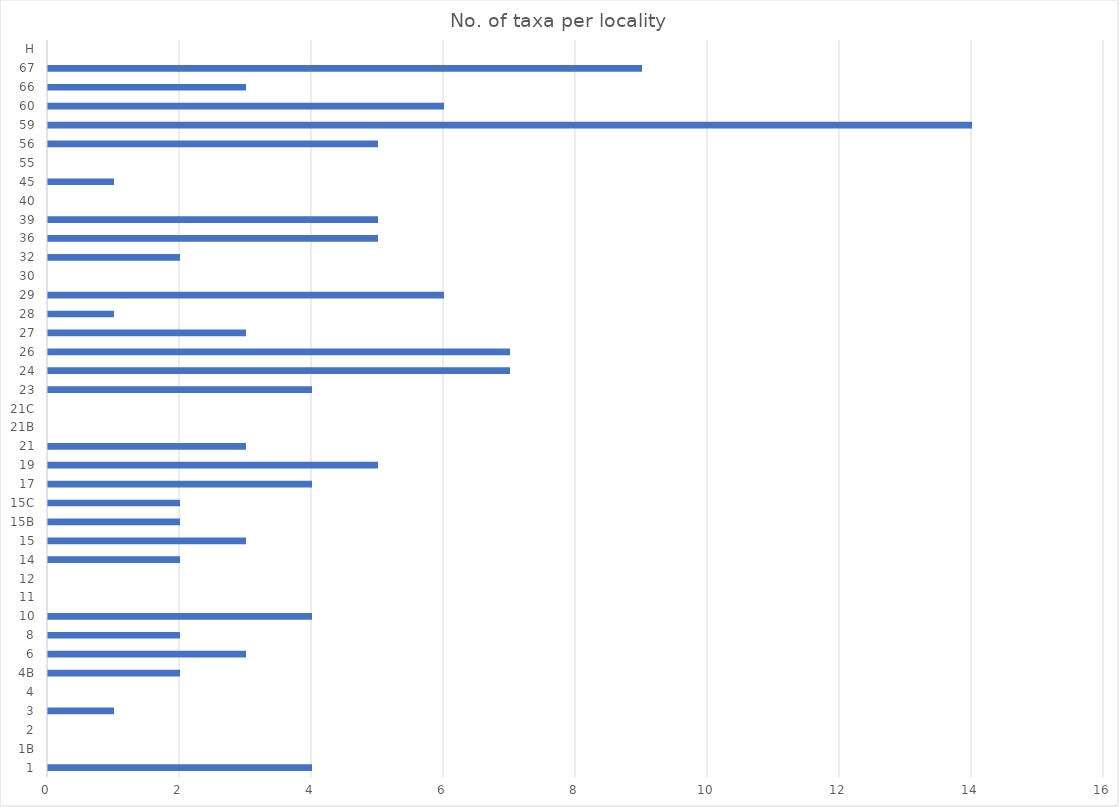
| Category | Series 0 |
|---|---|
| 1 | 4 |
| 1B | 0 |
| 2 | 0 |
| 3 | 1 |
| 4 | 0 |
| 4B | 2 |
| 6 | 3 |
| 8 | 2 |
| 10 | 4 |
| 11 | 0 |
| 12 | 0 |
| 14 | 2 |
| 15 | 3 |
| 15B | 2 |
| 15C | 2 |
| 17 | 4 |
| 19 | 5 |
| 21 | 3 |
| 21B | 0 |
| 21C | 0 |
| 23 | 4 |
| 24 | 7 |
| 26 | 7 |
| 27 | 3 |
| 28 | 1 |
| 29 | 6 |
| 30 | 0 |
| 32 | 2 |
| 36 | 5 |
| 39 | 5 |
| 40 | 0 |
| 45 | 1 |
| 55 | 0 |
| 56 | 5 |
| 59 | 14 |
| 60 | 6 |
| 66 | 3 |
| 67 | 9 |
| H | 0 |